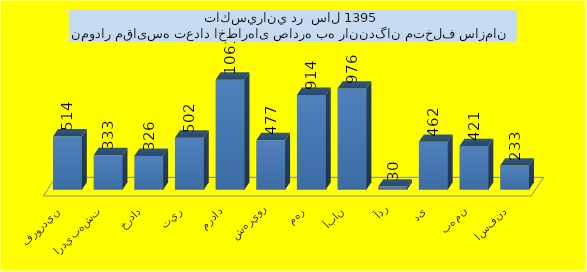
| Category | تعداد |
|---|---|
| فروردين | 514 |
| ارديبهشت | 333 |
| خرداد | 326 |
| تير | 502 |
| مرداد | 1061 |
| شهريور | 477 |
| مهر | 914 |
| آبان | 976 |
| آذر | 30 |
| دی | 462 |
| بهمن | 421 |
| اسفند | 233 |